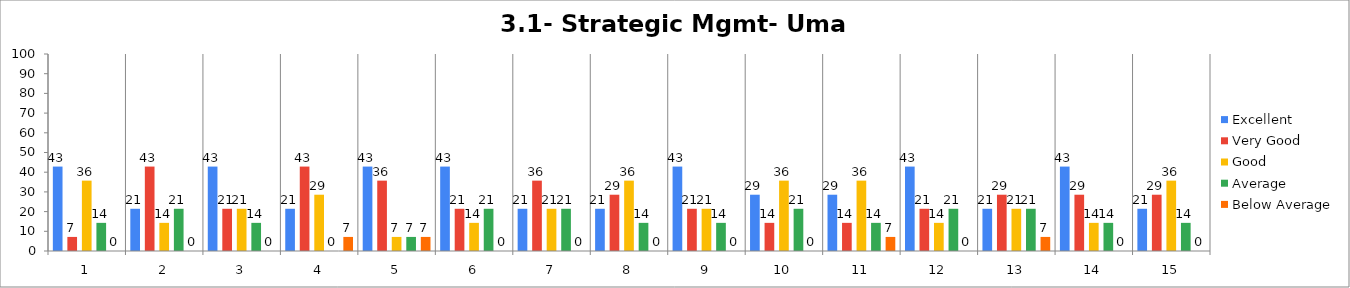
| Category | Excellent | Very Good | Good | Average | Below Average |
|---|---|---|---|---|---|
| 0 | 42.857 | 7.143 | 35.714 | 14.286 | 0 |
| 1 | 21.429 | 42.857 | 14.286 | 21.429 | 0 |
| 2 | 42.857 | 21.429 | 21.429 | 14.286 | 0 |
| 3 | 21.429 | 42.857 | 28.571 | 0 | 7.143 |
| 4 | 42.857 | 35.714 | 7.143 | 7.143 | 7.143 |
| 5 | 42.857 | 21.429 | 14.286 | 21.429 | 0 |
| 6 | 21.429 | 35.714 | 21.429 | 21.429 | 0 |
| 7 | 21.429 | 28.571 | 35.714 | 14.286 | 0 |
| 8 | 42.857 | 21.429 | 21.429 | 14.286 | 0 |
| 9 | 28.571 | 14.286 | 35.714 | 21.429 | 0 |
| 10 | 28.571 | 14.286 | 35.714 | 14.286 | 7.143 |
| 11 | 42.857 | 21.429 | 14.286 | 21.429 | 0 |
| 12 | 21.429 | 28.571 | 21.429 | 21.429 | 7.143 |
| 13 | 42.857 | 28.571 | 14.286 | 14.286 | 0 |
| 14 | 21.429 | 28.571 | 35.714 | 14.286 | 0 |